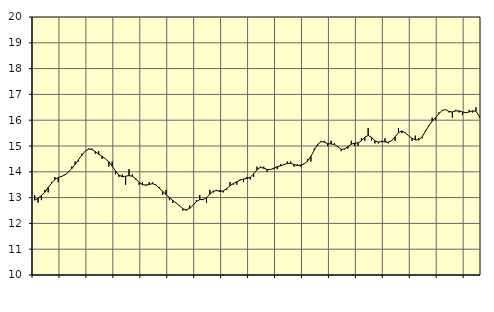
| Category | Piggar | Vård och omsorg, SNI 86-88 |
|---|---|---|
| nan | 13.1 | 12.9 |
| 87.0 | 12.8 | 12.98 |
| 87.0 | 12.9 | 13.08 |
| 87.0 | 13.3 | 13.21 |
| nan | 13.2 | 13.39 |
| 88.0 | 13.6 | 13.56 |
| 88.0 | 13.8 | 13.7 |
| 88.0 | 13.6 | 13.78 |
| nan | 13.8 | 13.82 |
| 89.0 | 13.9 | 13.88 |
| 89.0 | 14 | 13.99 |
| 89.0 | 14.2 | 14.12 |
| nan | 14.4 | 14.29 |
| 90.0 | 14.4 | 14.47 |
| 90.0 | 14.7 | 14.64 |
| 90.0 | 14.8 | 14.8 |
| nan | 14.9 | 14.88 |
| 91.0 | 14.9 | 14.87 |
| 91.0 | 14.7 | 14.78 |
| 91.0 | 14.8 | 14.68 |
| nan | 14.5 | 14.6 |
| 92.0 | 14.5 | 14.5 |
| 92.0 | 14.2 | 14.39 |
| 92.0 | 14.4 | 14.22 |
| nan | 13.9 | 14.03 |
| 93.0 | 13.8 | 13.87 |
| 93.0 | 13.9 | 13.81 |
| 93.0 | 13.5 | 13.83 |
| nan | 14.1 | 13.85 |
| 94.0 | 13.9 | 13.83 |
| 94.0 | 13.7 | 13.73 |
| 94.0 | 13.5 | 13.59 |
| nan | 13.6 | 13.5 |
| 95.0 | 13.5 | 13.48 |
| 95.0 | 13.6 | 13.51 |
| 95.0 | 13.6 | 13.54 |
| nan | 13.5 | 13.49 |
| 96.0 | 13.4 | 13.36 |
| 96.0 | 13.1 | 13.24 |
| 96.0 | 13.3 | 13.12 |
| nan | 12.9 | 13 |
| 97.0 | 12.8 | 12.89 |
| 97.0 | 12.8 | 12.79 |
| 97.0 | 12.7 | 12.68 |
| nan | 12.5 | 12.56 |
| 98.0 | 12.5 | 12.53 |
| 98.0 | 12.7 | 12.58 |
| 98.0 | 12.7 | 12.7 |
| nan | 12.9 | 12.85 |
| 99.0 | 13.1 | 12.92 |
| 99.0 | 12.9 | 12.93 |
| 99.0 | 12.8 | 12.99 |
| nan | 13.3 | 13.13 |
| 0.0 | 13.2 | 13.25 |
| 0.0 | 13.3 | 13.27 |
| 0.0 | 13.3 | 13.24 |
| nan | 13.2 | 13.26 |
| 1.0 | 13.3 | 13.35 |
| 1.0 | 13.6 | 13.46 |
| 1.0 | 13.5 | 13.55 |
| nan | 13.5 | 13.61 |
| 2.0 | 13.7 | 13.68 |
| 2.0 | 13.6 | 13.72 |
| 2.0 | 13.8 | 13.74 |
| nan | 13.7 | 13.79 |
| 3.0 | 13.8 | 13.92 |
| 3.0 | 14.2 | 14.08 |
| 3.0 | 14.2 | 14.17 |
| nan | 14.2 | 14.14 |
| 4.0 | 14 | 14.09 |
| 4.0 | 14.1 | 14.09 |
| 4.0 | 14.1 | 14.14 |
| nan | 14.1 | 14.2 |
| 5.0 | 14.3 | 14.23 |
| 5.0 | 14.3 | 14.28 |
| 5.0 | 14.4 | 14.32 |
| nan | 14.4 | 14.33 |
| 6.0 | 14.2 | 14.28 |
| 6.0 | 14.3 | 14.24 |
| 6.0 | 14.2 | 14.26 |
| nan | 14.3 | 14.31 |
| 7.0 | 14.5 | 14.41 |
| 7.0 | 14.4 | 14.6 |
| 7.0 | 14.9 | 14.84 |
| nan | 15 | 15.06 |
| 8.0 | 15.2 | 15.17 |
| 8.0 | 15.2 | 15.15 |
| 8.0 | 15 | 15.09 |
| nan | 15.2 | 15.08 |
| 9.0 | 15.1 | 15.06 |
| 9.0 | 15 | 14.97 |
| 9.0 | 14.8 | 14.87 |
| nan | 14.9 | 14.88 |
| 10.0 | 14.9 | 14.98 |
| 10.0 | 15.2 | 15.07 |
| 10.0 | 15 | 15.11 |
| nan | 15 | 15.12 |
| 11.0 | 15.3 | 15.2 |
| 11.0 | 15.2 | 15.34 |
| 11.0 | 15.7 | 15.41 |
| nan | 15.2 | 15.34 |
| 12.0 | 15.1 | 15.2 |
| 12.0 | 15.1 | 15.15 |
| 12.0 | 15.2 | 15.17 |
| nan | 15.3 | 15.16 |
| 13.0 | 15.1 | 15.15 |
| 13.0 | 15.2 | 15.21 |
| 13.0 | 15.2 | 15.36 |
| nan | 15.7 | 15.52 |
| 14.0 | 15.5 | 15.58 |
| 14.0 | 15.5 | 15.51 |
| 14.0 | 15.4 | 15.4 |
| nan | 15.2 | 15.3 |
| 15.0 | 15.4 | 15.24 |
| 15.0 | 15.3 | 15.24 |
| 15.0 | 15.3 | 15.35 |
| nan | 15.6 | 15.57 |
| 16.0 | 15.8 | 15.78 |
| 16.0 | 16.1 | 15.96 |
| 16.0 | 16 | 16.1 |
| nan | 16.3 | 16.25 |
| 17.0 | 16.4 | 16.38 |
| 17.0 | 16.4 | 16.41 |
| 17.0 | 16.3 | 16.34 |
| nan | 16.1 | 16.32 |
| 18.0 | 16.4 | 16.36 |
| 18.0 | 16.3 | 16.36 |
| 18.0 | 16.2 | 16.32 |
| nan | 16.3 | 16.29 |
| 19.0 | 16.4 | 16.32 |
| 19.0 | 16.3 | 16.36 |
| 19.0 | 16.5 | 16.35 |
| nan | 16.1 | 16.15 |